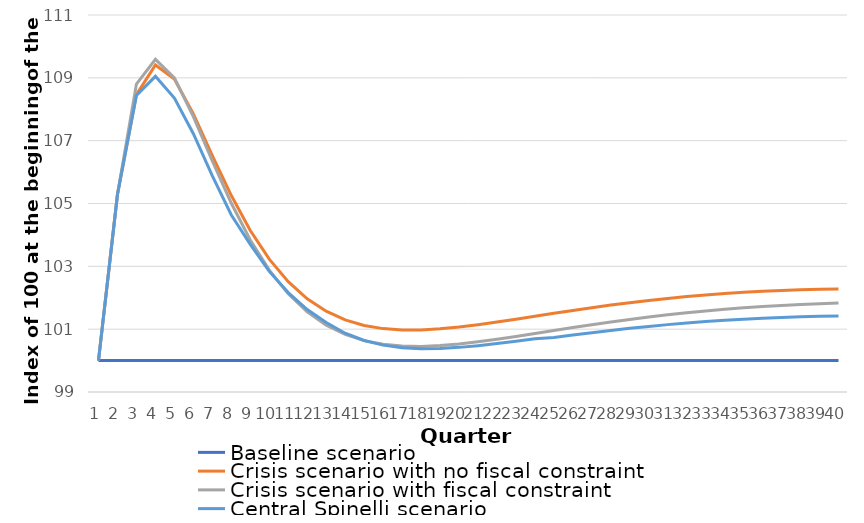
| Category | Baseline scenario | Crisis scenario with no fiscal constraint | Crisis scenario with fiscal constraint | Central Spinelli scenario |
|---|---|---|---|---|
| 0 | 100 | 100 | 100 | 100 |
| 1 | 100 | 105.286 | 105.286 | 105.287 |
| 2 | 100 | 108.467 | 108.803 | 108.441 |
| 3 | 100 | 109.409 | 109.588 | 109.048 |
| 4 | 100 | 108.965 | 108.999 | 108.354 |
| 5 | 100 | 107.849 | 107.767 | 107.221 |
| 6 | 100 | 106.527 | 106.353 | 105.881 |
| 7 | 100 | 105.253 | 105.007 | 104.634 |
| 8 | 100 | 104.141 | 103.839 | 103.701 |
| 9 | 100 | 103.228 | 102.879 | 102.839 |
| 10 | 100 | 102.51 | 102.124 | 102.163 |
| 11 | 100 | 101.966 | 101.549 | 101.623 |
| 12 | 100 | 101.571 | 101.127 | 101.213 |
| 13 | 100 | 101.297 | 100.831 | 100.87 |
| 14 | 100 | 101.119 | 100.635 | 100.639 |
| 15 | 100 | 101.018 | 100.517 | 100.492 |
| 16 | 100 | 100.975 | 100.461 | 100.411 |
| 17 | 100 | 100.976 | 100.452 | 100.38 |
| 18 | 100 | 101.01 | 100.478 | 100.387 |
| 19 | 100 | 101.068 | 100.529 | 100.421 |
| 20 | 100 | 101.143 | 100.599 | 100.474 |
| 21 | 100 | 101.227 | 100.68 | 100.541 |
| 22 | 100 | 101.318 | 100.77 | 100.617 |
| 23 | 100 | 101.412 | 100.863 | 100.697 |
| 24 | 100 | 101.505 | 100.957 | 100.732 |
| 25 | 100 | 101.596 | 101.05 | 100.813 |
| 26 | 100 | 101.684 | 101.141 | 100.888 |
| 27 | 100 | 101.766 | 101.228 | 100.959 |
| 28 | 100 | 101.844 | 101.31 | 101.026 |
| 29 | 100 | 101.915 | 101.387 | 101.088 |
| 30 | 100 | 101.979 | 101.457 | 101.145 |
| 31 | 100 | 102.037 | 101.522 | 101.196 |
| 32 | 100 | 102.089 | 101.581 | 101.242 |
| 33 | 100 | 102.134 | 101.634 | 101.282 |
| 34 | 100 | 102.173 | 101.681 | 101.317 |
| 35 | 100 | 102.205 | 101.721 | 101.347 |
| 36 | 100 | 102.232 | 101.757 | 101.373 |
| 37 | 100 | 102.253 | 101.786 | 101.393 |
| 38 | 100 | 102.268 | 101.811 | 101.409 |
| 39 | 100 | 102.278 | 101.831 | 101.42 |